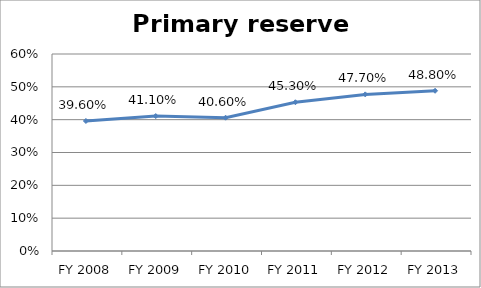
| Category | Primary reserve ratio |
|---|---|
| FY 2013 | 0.488 |
| FY 2012 | 0.477 |
| FY 2011 | 0.453 |
| FY 2010 | 0.406 |
| FY 2009 | 0.411 |
| FY 2008 | 0.396 |